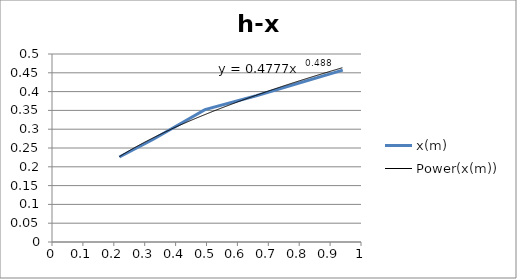
| Category | x(m) |
|---|---|
| 0.218 | 0.226 |
| 0.325 | 0.272 |
| 0.495 | 0.352 |
| 0.661 | 0.389 |
| 0.941 | 0.457 |